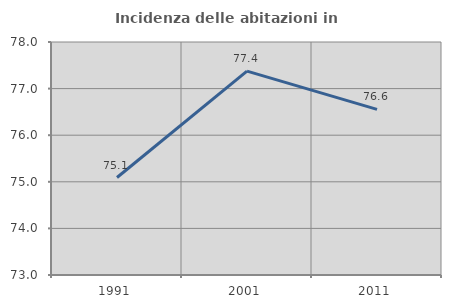
| Category | Incidenza delle abitazioni in proprietà  |
|---|---|
| 1991.0 | 75.092 |
| 2001.0 | 77.375 |
| 2011.0 | 76.554 |